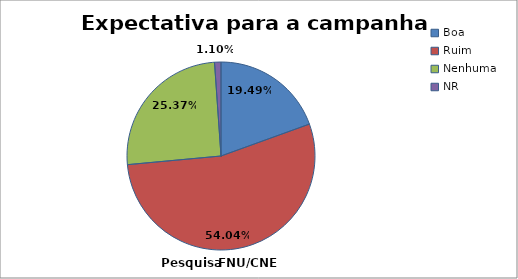
| Category | % |
|---|---|
| Boa | 0.195 |
| Ruim | 0.54 |
| Nenhuma | 0.254 |
| NR | 0.011 |